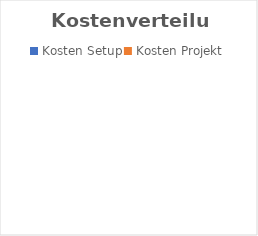
| Category | Series 0 |
|---|---|
| Kosten Setup | 0 |
| Kosten Projekt | 0 |